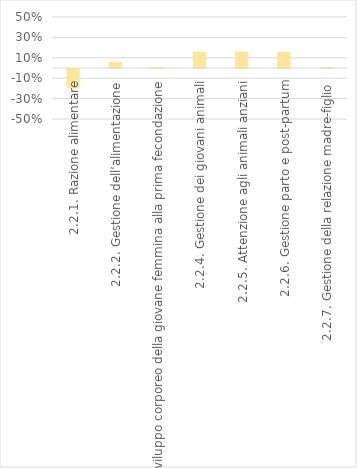
| Category | Series 0 |
|---|---|
| 2.2.1. Razione alimentare | -0.19 |
| 2.2.2. Gestione dell’alimentazione | 0.06 |
| 2.2.3. Sviluppo corporeo della giovane femmina alla prima fecondazione | 0.01 |
| 2.2.4. Gestione dei giovani animali | 0.16 |
| 2.2.5. Attenzione agli animali anziani | 0.16 |
| 2.2.6. Gestione parto e post-partum | 0.16 |
| 2.2.7. Gestione della relazione madre-figlio | 0.01 |